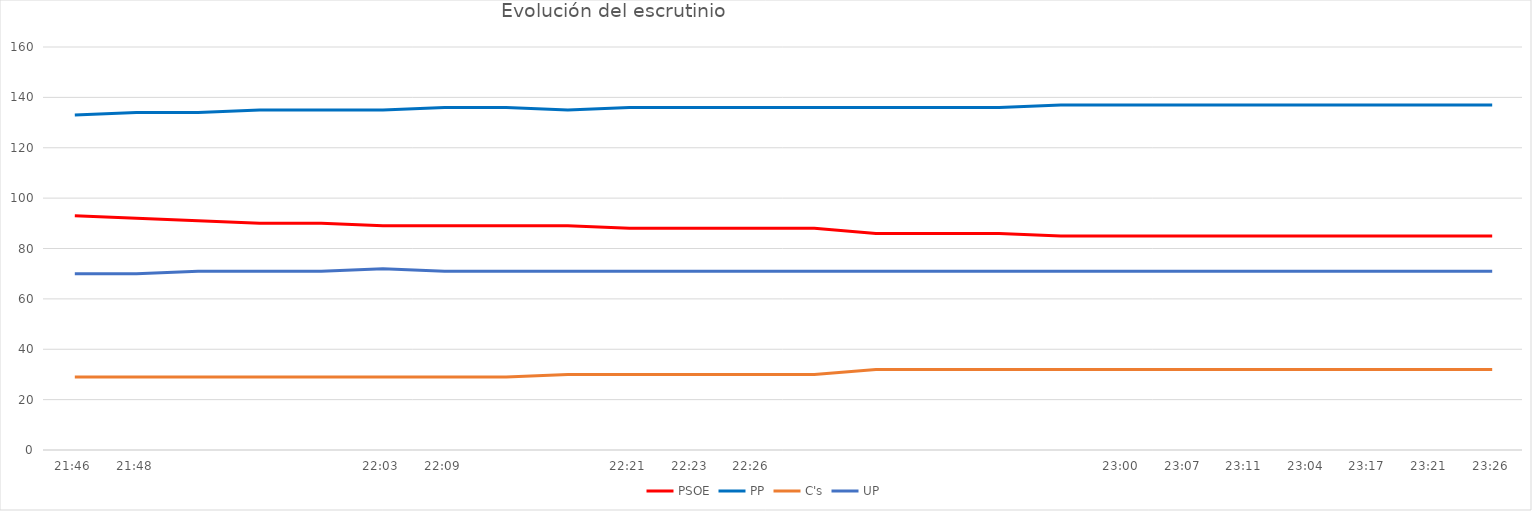
| Category | PSOE | PP | C's | UP |
|---|---|---|---|---|
| 0.9069444444444444 | 93 | 133 | 29 | 70 |
| 0.9083333333333333 | 92 | 134 | 29 | 70 |
| nan | 91 | 134 | 29 | 71 |
| nan | 90 | 135 | 29 | 71 |
| nan | 90 | 135 | 29 | 71 |
| 0.9187500000000001 | 89 | 135 | 29 | 72 |
| 0.9229166666666666 | 89 | 136 | 29 | 71 |
| nan | 89 | 136 | 29 | 71 |
| nan | 89 | 135 | 30 | 71 |
| 0.93125 | 88 | 136 | 30 | 71 |
| 0.9326388888888889 | 88 | 136 | 30 | 71 |
| 0.9347222222222222 | 88 | 136 | 30 | 71 |
| nan | 88 | 136 | 30 | 71 |
| nan | 86 | 136 | 32 | 71 |
| nan | 86 | 136 | 32 | 71 |
| nan | 86 | 136 | 32 | 71 |
| nan | 85 | 137 | 32 | 71 |
| 0.9583333333333334 | 85 | 137 | 32 | 71 |
| 0.9631944444444445 | 85 | 137 | 32 | 71 |
| 0.9659722222222222 | 85 | 137 | 32 | 71 |
| 0.9611111111111111 | 85 | 137 | 32 | 71 |
| 0.970138888888889 | 85 | 137 | 32 | 71 |
| 0.9729166666666668 | 85 | 137 | 32 | 71 |
| 0.9763888888888889 | 85 | 137 | 32 | 71 |